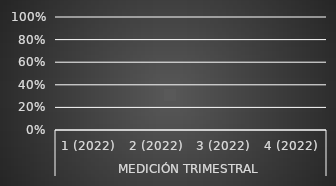
| Category | Series 0 |
|---|---|
| 0 | 0 |
| 1 | 0 |
| 2 | 0 |
| 3 | 0 |